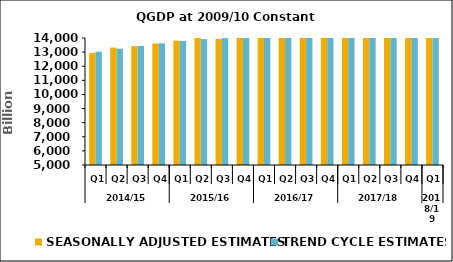
| Category | SEASONALLY ADJUSTED ESTIMATES | TREND CYCLE ESTIMATES |
|---|---|---|
| 0 | 12946.292 | 13031.71 |
| 1 | 13319.347 | 13239.979 |
| 2 | 13421.974 | 13436.372 |
| 3 | 13607.24 | 13620.23 |
| 4 | 13815.208 | 13796.042 |
| 5 | 14009.81 | 13919.66 |
| 6 | 13927.777 | 13989.91 |
| 7 | 14043.378 | 14057.015 |
| 8 | 14151.902 | 14174.775 |
| 9 | 14368.719 | 14363.247 |
| 10 | 14578.629 | 14635.853 |
| 11 | 14961.751 | 14894.131 |
| 12 | 15116.022 | 15112.296 |
| 13 | 15256.373 | 15279.121 |
| 14 | 15410.631 | 15475.707 |
| 15 | 15736.908 | 15751.622 |
| 16 | 16179.732 | 16079.909 |